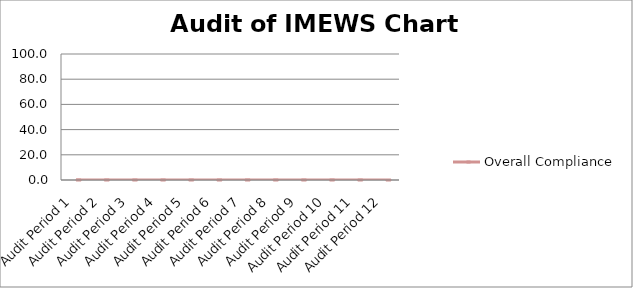
| Category | Overall Compliance |
|---|---|
| Audit Period 1 | 0 |
| Audit Period 2 | 0 |
| Audit Period 3 | 0 |
| Audit Period 4 | 0 |
| Audit Period 5 | 0 |
| Audit Period 6 | 0 |
| Audit Period 7 | 0 |
| Audit Period 8 | 0 |
| Audit Period 9 | 0 |
| Audit Period 10 | 0 |
| Audit Period 11 | 0 |
| Audit Period 12 | 0 |